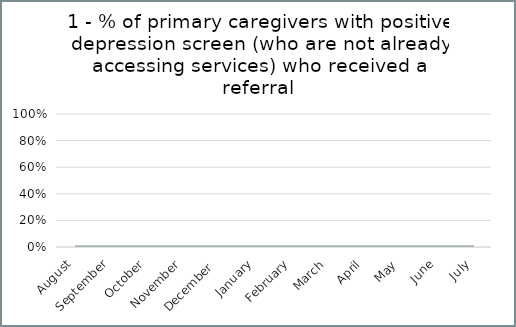
| Category | 1 - % of primary caregivers with positive depression screen (who are not already accessing services) who received a referral |
|---|---|
| August | 0 |
| September | 0 |
| October | 0 |
| November | 0 |
| December  | 0 |
| January | 0 |
| February | 0 |
| March | 0 |
| April | 0 |
| May | 0 |
| June | 0 |
| July | 0 |